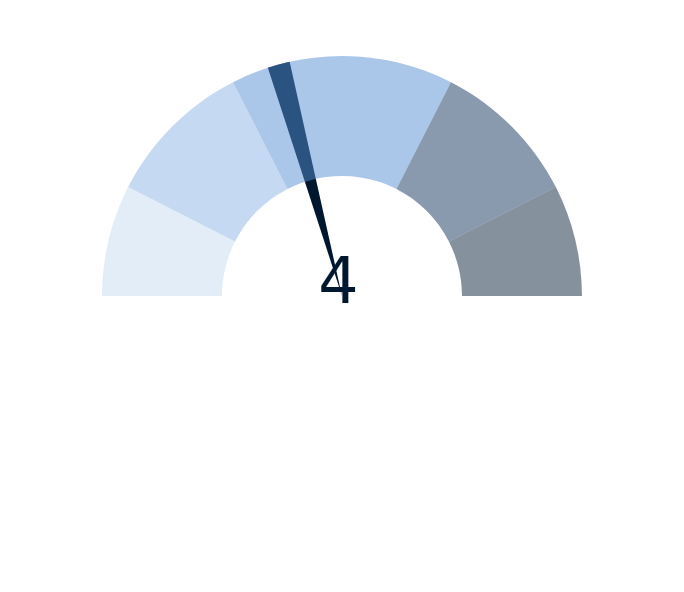
| Category | factor |
|---|---|
| 0 | 4 |
| 1 | 0.3 |
| 2 | 15.7 |